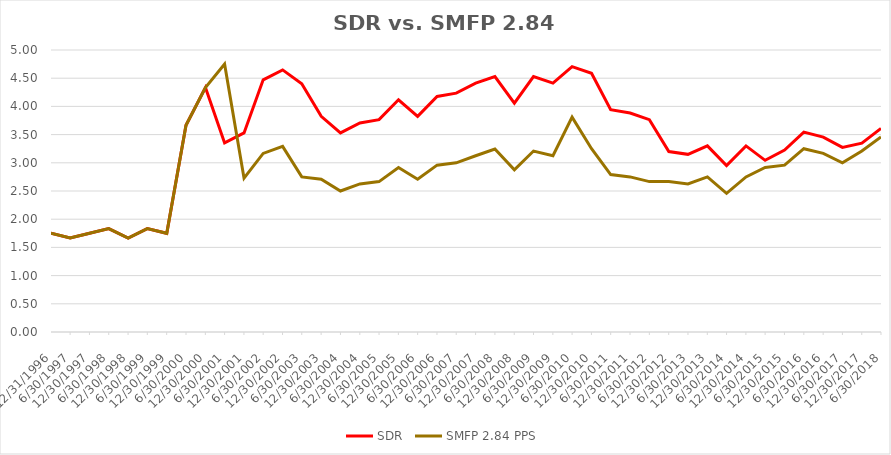
| Category | SDR | SMFP 2.84 PPS |
|---|---|---|
| 12/31/96 | 1.75 | 1.75 |
| 6/30/97 | 1.667 | 1.667 |
| 12/31/97 | 1.75 | 1.75 |
| 6/30/98 | 1.833 | 1.833 |
| 12/31/98 | 1.667 | 1.667 |
| 6/30/99 | 1.833 | 1.833 |
| 12/31/99 | 1.75 | 1.75 |
| 6/30/00 | 3.667 | 3.667 |
| 12/31/00 | 4.333 | 4.333 |
| 6/30/01 | 3.353 | 4.75 |
| 12/31/01 | 3.529 | 2.727 |
| 6/30/02 | 4.471 | 3.167 |
| 12/31/02 | 4.647 | 3.292 |
| 6/30/03 | 4.4 | 2.75 |
| 12/31/03 | 3.824 | 2.708 |
| 6/30/04 | 3.529 | 2.5 |
| 12/31/04 | 3.706 | 2.625 |
| 6/30/05 | 3.765 | 2.667 |
| 12/31/05 | 4.118 | 2.917 |
| 6/30/06 | 3.824 | 2.708 |
| 12/31/06 | 4.176 | 2.958 |
| 6/30/07 | 4.235 | 3 |
| 12/31/07 | 4.412 | 3.125 |
| 6/30/08 | 4.529 | 3.244 |
| 12/31/08 | 4.059 | 2.875 |
| 6/30/09 | 4.529 | 3.208 |
| 12/31/09 | 4.412 | 3.125 |
| 6/30/10 | 4.706 | 3.81 |
| 12/31/10 | 4.588 | 3.25 |
| 6/30/11 | 3.941 | 2.792 |
| 12/31/11 | 3.882 | 2.75 |
| 6/30/12 | 3.765 | 2.667 |
| 12/31/12 | 3.2 | 2.667 |
| 6/30/13 | 3.15 | 2.625 |
| 12/31/13 | 3.3 | 2.75 |
| 6/30/14 | 2.95 | 2.458 |
| 12/31/14 | 3.3 | 2.75 |
| 6/30/15 | 3.043 | 2.917 |
| 12/31/15 | 3.227 | 2.958 |
| 6/30/16 | 3.545 | 3.25 |
| 12/31/16 | 3.455 | 3.167 |
| 6/30/17 | 3.273 | 3 |
| 12/31/17 | 3.348 | 3.208 |
| 6/30/18 | 3.609 | 3.458 |